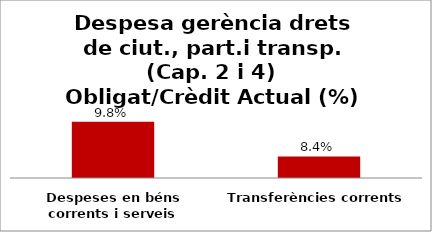
| Category | Series 0 |
|---|---|
| Despeses en béns corrents i serveis | 0.098 |
| Transferències corrents | 0.084 |